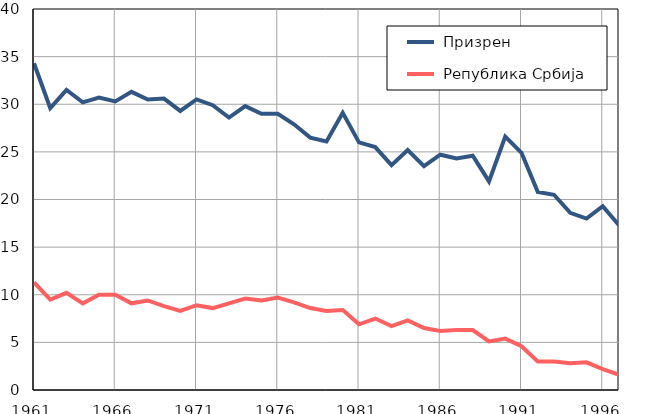
| Category |  Призрен |  Република Србија |
|---|---|---|
| 1961.0 | 34.3 | 11.3 |
| 1962.0 | 29.6 | 9.5 |
| 1963.0 | 31.5 | 10.2 |
| 1964.0 | 30.2 | 9.1 |
| 1965.0 | 30.7 | 10 |
| 1966.0 | 30.3 | 10 |
| 1967.0 | 31.3 | 9.1 |
| 1968.0 | 30.5 | 9.4 |
| 1969.0 | 30.6 | 8.8 |
| 1970.0 | 29.3 | 8.3 |
| 1971.0 | 30.5 | 8.9 |
| 1972.0 | 29.9 | 8.6 |
| 1973.0 | 28.6 | 9.1 |
| 1974.0 | 29.8 | 9.6 |
| 1975.0 | 29 | 9.4 |
| 1976.0 | 29 | 9.7 |
| 1977.0 | 27.9 | 9.2 |
| 1978.0 | 26.5 | 8.6 |
| 1979.0 | 26.1 | 8.3 |
| 1980.0 | 29.1 | 8.4 |
| 1981.0 | 26 | 6.9 |
| 1982.0 | 25.5 | 7.5 |
| 1983.0 | 23.6 | 6.7 |
| 1984.0 | 25.2 | 7.3 |
| 1985.0 | 23.5 | 6.5 |
| 1986.0 | 24.7 | 6.2 |
| 1987.0 | 24.3 | 6.3 |
| 1988.0 | 24.6 | 6.3 |
| 1989.0 | 21.9 | 5.1 |
| 1990.0 | 26.6 | 5.4 |
| 1991.0 | 24.9 | 4.6 |
| 1992.0 | 20.8 | 3 |
| 1993.0 | 20.5 | 3 |
| 1994.0 | 18.6 | 2.8 |
| 1995.0 | 18 | 2.9 |
| 1996.0 | 19.3 | 2.2 |
| 1997.0 | 17.3 | 1.6 |